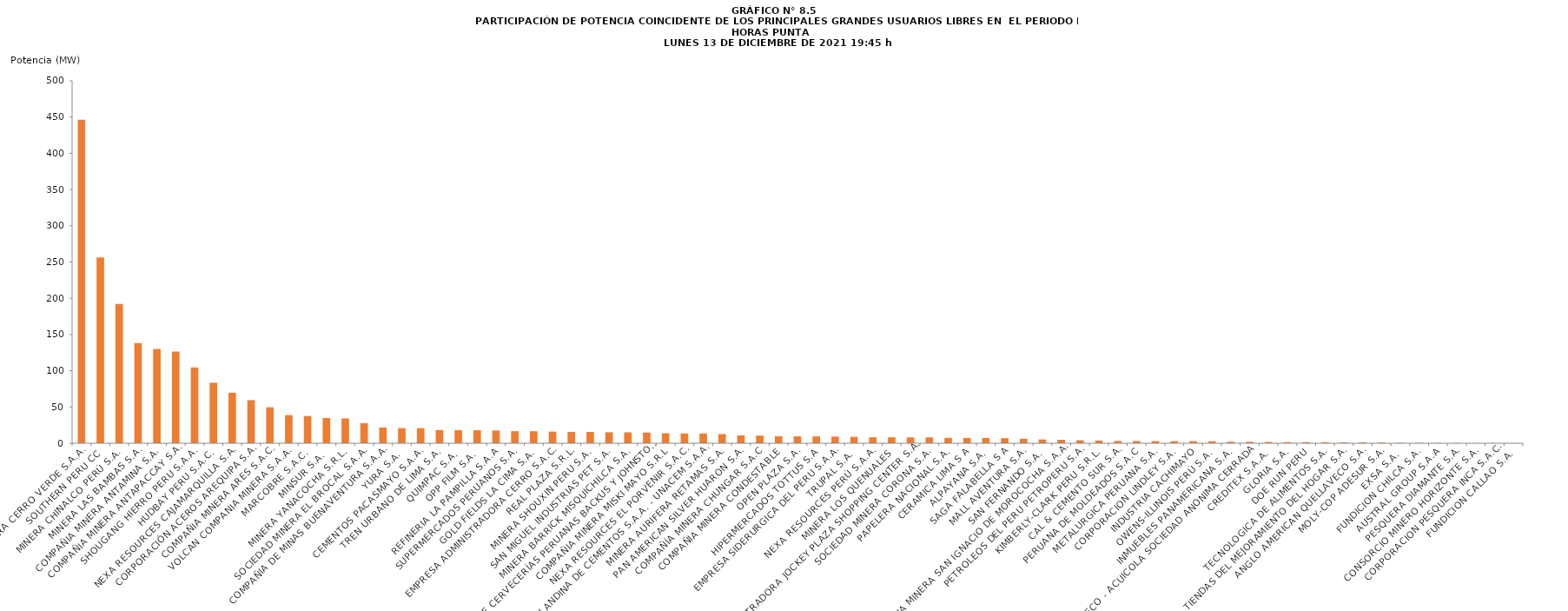
| Category | Series 0 |
|---|---|
| SOCIEDAD MINERA CERRO VERDE S.A.A. | 446.21 |
| SOUTHERN PERU CC | 256.21 |
| MINERA CHINALCO PERÚ S.A. | 192.21 |
| MINERA LAS BAMBAS S.A. | 138.26 |
| COMPAÑIA MINERA ANTAMINA S.A. | 129.99 |
| COMPAÑIA MINERA ANTAPACCAY S.A. | 126.36 |
| SHOUGANG HIERRO PERU S.A.A. | 104.56 |
| HUDBAY PERU S.A.C. | 83.5 |
| NEXA RESOURCES CAJAMARQUILLA S.A. | 69.71 |
| CORPORACIÓN ACEROS AREQUIPA S.A. | 59.43 |
| COMPAÑIA MINERA ARES S.A.C. | 49.62 |
| VOLCAN COMPANIA MINERA S.A.A. | 38.82 |
| MARCOBRE S.A.C. | 37.59 |
| MINSUR S.A. | 34.77 |
| MINERA YANACOCHA S.R.L. | 34.25 |
| SOCIEDAD MINERA EL BROCAL S.A.A. | 27.76 |
| COMPAÑIA DE MINAS BUENAVENTURA S.A.A. | 21.75 |
| YURA S.A. | 20.84 |
| CEMENTOS PACASMAYO S.A.A. | 20.82 |
| TREN URBANO DE LIMA S.A. | 18.19 |
| QUIMPAC S.A. | 18.05 |
| OPP FILM S.A. | 17.89 |
| REFINERIA LA PAMPILLA S.A.A | 17.59 |
| SUPERMERCADOS PERUANOS S.A. | 16.68 |
| GOLD FIELDS LA CIMA S.A. | 16.55 |
| EMPRESA ADMINISTRADORA CERRO S.A.C. | 16.07 |
| REAL PLAZA S.R.L. | 15.66 |
| MINERA SHOUXIN PERU S.A. | 15.57 |
| SAN MIGUEL INDUSTRIAS PET S.A. | 15.12 |
| MINERA BARRICK MISQUICHILCA S.A. | 15.04 |
| UNIÓN DE CERVECERÍAS PERUANAS BACKUS Y JOHNSTON S. | 14.68 |
| COMPAÑIA MINERA MISKI MAYO S.R.L | 13.83 |
| NEXA RESOURCES EL PORVENIR S.A.C. | 13.52 |
| UNION ANDINA DE CEMENTOS S.A.A. - UNACEM S.A.A. | 13.46 |
| MINERA AURIFERA RETAMAS S.A. | 12.61 |
| PAN AMERICAN SILVER HUARON S.A. | 10.76 |
| COMPAÑÍA MINERA CHUNGAR S.A.C | 10.6 |
| COMPAÑIA MINERA CONDESTABLE | 9.57 |
| OPEN PLAZA S.A. | 9.53 |
| HIPERMERCADOS TOTTUS S.A | 9.4 |
| EMPRESA SIDERURGICA DEL PERU S.A.A. | 9.21 |
| TRUPAL S.A. | 8.86 |
| NEXA RESOURCES PERÚ S.A.A. | 8.23 |
| MINERA LOS QUENUALES | 8.18 |
| ADMINISTRADORA JOCKEY PLAZA SHOPPING CENTER S.A. | 8.1 |
| SOCIEDAD MINERA CORONA S.A. | 8.08 |
| PAPELERA NACIONAL S.A. | 7.38 |
| CERAMICA LIMA S A | 7.31 |
| ALPAYANA S.A. | 7.2 |
| SAGA FALABELLA S A | 6.98 |
| MALL AVENTURA S.A. | 6.28 |
| SAN FERNANDO S.A. | 5.25 |
| COMPAÑIA MINERA SAN IGNACIO DE MOROCOCHA S.A.A. | 4.79 |
| PETROLEOS DEL PERU PETROPERU S.A. | 4.13 |
| KIMBERLY-CLARK PERU S.R.L. | 3.64 |
| CAL & CEMENTO SUR S.A. | 3.15 |
| PERUANA DE MOLDEADOS S.A.C | 3.01 |
| METALURGICA PERUANA S.A. | 2.98 |
| CORPORACION LINDLEY S.A. | 2.85 |
| INDUSTRIA CACHIMAYO | 2.82 |
| OWENS-ILLINOIS PERÚ S.A. | 2.78 |
| INMUEBLES PANAMERICANA S.A. | 2.09 |
| ECO - ACUICOLA SOCIEDAD ANONIMA CERRADA | 2 |
| CREDITEX S.A.A. | 1.81 |
| GLORIA S.A. | 1.59 |
| DOE RUN PERU | 1.52 |
| TECNOLOGICA DE ALIMENTOS S.A. | 1.4 |
| TIENDAS DEL MEJORAMIENTO DEL HOGAR S.A. | 1.26 |
| ANGLO AMERICAN QUELLAVECO S.A. | 1.24 |
| MOLY-COP ADESUR S.A. | 1.07 |
| EXSA S.A. | 0.69 |
| FUNDICION CHILCA S.A. | 0.55 |
| AUSTRAL GROUP S.A.A | 0.45 |
| PESQUERA DIAMANTE S.A. | 0.41 |
| CONSORCIO MINERO HORIZONTE S.A. | 0.3 |
| CORPORACION PESQUERA INCA S.A.C. | 0.22 |
| FUNDICION CALLAO S.A. | 0.14 |